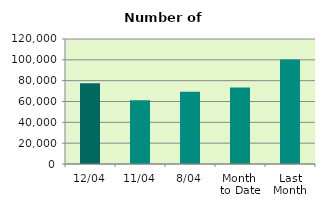
| Category | Series 0 |
|---|---|
| 12/04 | 77612 |
| 11/04 | 61086 |
| 8/04 | 69436 |
| Month 
to Date | 73373.75 |
| Last
Month | 100276.783 |